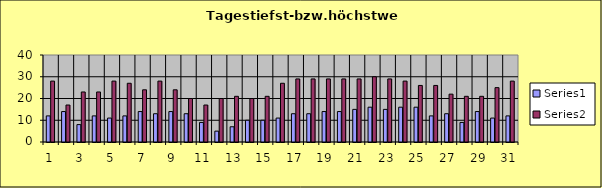
| Category | Series 0 | Series 1 |
|---|---|---|
| 0 | 12 | 28 |
| 1 | 14 | 17 |
| 2 | 8 | 23 |
| 3 | 12 | 23 |
| 4 | 11 | 28 |
| 5 | 12 | 27 |
| 6 | 14 | 24 |
| 7 | 13 | 28 |
| 8 | 14 | 24 |
| 9 | 13 | 20 |
| 10 | 9 | 17 |
| 11 | 5 | 20 |
| 12 | 7 | 21 |
| 13 | 10 | 20 |
| 14 | 10 | 21 |
| 15 | 11 | 27 |
| 16 | 13 | 29 |
| 17 | 13 | 29 |
| 18 | 14 | 29 |
| 19 | 14 | 29 |
| 20 | 15 | 29 |
| 21 | 16 | 30 |
| 22 | 15 | 29 |
| 23 | 16 | 28 |
| 24 | 16 | 26 |
| 25 | 12 | 26 |
| 26 | 13 | 22 |
| 27 | 9 | 21 |
| 28 | 14 | 21 |
| 29 | 11 | 25 |
| 30 | 12 | 28 |